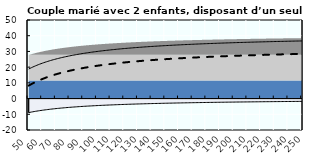
| Category | Coin fiscal moyen (somme des composantes) | Taux moyen d'imposition net en % du salaire brut |
|---|---|---|
| 50.0 | 18.798 | 8.242 |
| 51.0 | 19.236 | 8.737 |
| 52.0 | 19.658 | 9.213 |
| 53.0 | 20.063 | 9.671 |
| 54.0 | 20.454 | 10.113 |
| 55.0 | 20.83 | 10.538 |
| 56.0 | 21.193 | 10.948 |
| 57.0 | 21.543 | 11.344 |
| 58.0 | 21.881 | 11.726 |
| 59.0 | 22.208 | 12.095 |
| 60.0 | 22.523 | 12.451 |
| 61.0 | 22.829 | 12.796 |
| 62.0 | 23.124 | 13.13 |
| 63.0 | 23.41 | 13.454 |
| 64.0 | 23.688 | 13.767 |
| 65.0 | 23.956 | 14.071 |
| 66.0 | 24.217 | 14.365 |
| 67.0 | 24.469 | 14.65 |
| 68.0 | 24.715 | 14.928 |
| 69.0 | 24.953 | 15.197 |
| 70.0 | 25.184 | 15.458 |
| 71.0 | 25.409 | 15.712 |
| 72.0 | 25.628 | 15.959 |
| 73.0 | 25.84 | 16.2 |
| 74.0 | 26.047 | 16.434 |
| 75.0 | 26.249 | 16.661 |
| 76.0 | 26.445 | 16.883 |
| 77.0 | 26.636 | 17.098 |
| 78.0 | 26.822 | 17.309 |
| 79.0 | 27.003 | 17.514 |
| 80.0 | 27.18 | 17.714 |
| 81.0 | 27.353 | 17.908 |
| 82.0 | 27.521 | 18.099 |
| 83.0 | 27.685 | 18.284 |
| 84.0 | 27.845 | 18.465 |
| 85.0 | 28.002 | 18.642 |
| 86.0 | 28.155 | 18.815 |
| 87.0 | 28.304 | 18.984 |
| 88.0 | 28.45 | 19.149 |
| 89.0 | 28.593 | 19.31 |
| 90.0 | 28.732 | 19.468 |
| 91.0 | 28.869 | 19.622 |
| 92.0 | 29.002 | 19.773 |
| 93.0 | 29.133 | 19.92 |
| 94.0 | 29.261 | 20.065 |
| 95.0 | 29.386 | 20.206 |
| 96.0 | 29.509 | 20.345 |
| 97.0 | 29.629 | 20.48 |
| 98.0 | 29.746 | 20.613 |
| 99.0 | 29.861 | 20.743 |
| 100.0 | 29.974 | 20.871 |
| 101.0 | 30.085 | 20.996 |
| 102.0 | 30.193 | 21.118 |
| 103.0 | 30.3 | 21.239 |
| 104.0 | 30.404 | 21.357 |
| 105.0 | 30.506 | 21.472 |
| 106.0 | 30.607 | 21.586 |
| 107.0 | 30.705 | 21.697 |
| 108.0 | 30.802 | 21.806 |
| 109.0 | 30.897 | 21.914 |
| 110.0 | 30.99 | 22.019 |
| 111.0 | 31.082 | 22.122 |
| 112.0 | 31.172 | 22.224 |
| 113.0 | 31.26 | 22.324 |
| 114.0 | 31.347 | 22.422 |
| 115.0 | 31.432 | 22.518 |
| 116.0 | 31.516 | 22.613 |
| 117.0 | 31.598 | 22.706 |
| 118.0 | 31.679 | 22.797 |
| 119.0 | 31.759 | 22.887 |
| 120.0 | 31.837 | 22.976 |
| 121.0 | 31.914 | 23.063 |
| 122.0 | 31.99 | 23.148 |
| 123.0 | 32.064 | 23.232 |
| 124.0 | 32.137 | 23.315 |
| 125.0 | 32.209 | 23.397 |
| 126.0 | 32.28 | 23.477 |
| 127.0 | 32.35 | 23.556 |
| 128.0 | 32.419 | 23.633 |
| 129.0 | 32.487 | 23.71 |
| 130.0 | 32.553 | 23.785 |
| 131.0 | 32.619 | 23.859 |
| 132.0 | 32.684 | 23.932 |
| 133.0 | 32.747 | 24.004 |
| 134.0 | 32.81 | 24.075 |
| 135.0 | 32.872 | 24.145 |
| 136.0 | 32.933 | 24.214 |
| 137.0 | 32.993 | 24.282 |
| 138.0 | 33.052 | 24.348 |
| 139.0 | 33.11 | 24.414 |
| 140.0 | 33.167 | 24.479 |
| 141.0 | 33.224 | 24.543 |
| 142.0 | 33.28 | 24.606 |
| 143.0 | 33.335 | 24.668 |
| 144.0 | 33.389 | 24.73 |
| 145.0 | 33.443 | 24.79 |
| 146.0 | 33.495 | 24.85 |
| 147.0 | 33.548 | 24.909 |
| 148.0 | 33.599 | 24.967 |
| 149.0 | 33.65 | 25.024 |
| 150.0 | 33.7 | 25.081 |
| 151.0 | 33.749 | 25.136 |
| 152.0 | 33.798 | 25.191 |
| 153.0 | 33.846 | 25.246 |
| 154.0 | 33.893 | 25.299 |
| 155.0 | 33.94 | 25.352 |
| 156.0 | 33.986 | 25.404 |
| 157.0 | 34.032 | 25.456 |
| 158.0 | 34.077 | 25.507 |
| 159.0 | 34.121 | 25.557 |
| 160.0 | 34.165 | 25.607 |
| 161.0 | 34.209 | 25.656 |
| 162.0 | 34.252 | 25.704 |
| 163.0 | 34.294 | 25.752 |
| 164.0 | 34.336 | 25.799 |
| 165.0 | 34.377 | 25.846 |
| 166.0 | 34.418 | 25.892 |
| 167.0 | 34.458 | 25.938 |
| 168.0 | 34.498 | 25.983 |
| 169.0 | 34.537 | 26.027 |
| 170.0 | 34.576 | 26.071 |
| 171.0 | 34.615 | 26.115 |
| 172.0 | 34.653 | 26.157 |
| 173.0 | 34.69 | 26.2 |
| 174.0 | 34.727 | 26.242 |
| 175.0 | 34.764 | 26.283 |
| 176.0 | 34.8 | 26.324 |
| 177.0 | 34.836 | 26.365 |
| 178.0 | 34.872 | 26.405 |
| 179.0 | 34.907 | 26.445 |
| 180.0 | 34.941 | 26.484 |
| 181.0 | 34.976 | 26.523 |
| 182.0 | 35.01 | 26.561 |
| 183.0 | 35.043 | 26.599 |
| 184.0 | 35.076 | 26.636 |
| 185.0 | 35.109 | 26.673 |
| 186.0 | 35.142 | 26.71 |
| 187.0 | 35.174 | 26.746 |
| 188.0 | 35.206 | 26.782 |
| 189.0 | 35.237 | 26.818 |
| 190.0 | 35.268 | 26.853 |
| 191.0 | 35.299 | 26.888 |
| 192.0 | 35.329 | 26.922 |
| 193.0 | 35.36 | 26.956 |
| 194.0 | 35.389 | 26.99 |
| 195.0 | 35.419 | 27.024 |
| 196.0 | 35.448 | 27.057 |
| 197.0 | 35.477 | 27.089 |
| 198.0 | 35.506 | 27.122 |
| 199.0 | 35.534 | 27.154 |
| 200.0 | 35.562 | 27.185 |
| 201.0 | 35.59 | 27.217 |
| 202.0 | 35.618 | 27.248 |
| 203.0 | 35.645 | 27.279 |
| 204.0 | 35.672 | 27.309 |
| 205.0 | 35.699 | 27.339 |
| 206.0 | 35.725 | 27.369 |
| 207.0 | 35.751 | 27.399 |
| 208.0 | 35.777 | 27.428 |
| 209.0 | 35.803 | 27.457 |
| 210.0 | 35.828 | 27.486 |
| 211.0 | 35.854 | 27.515 |
| 212.0 | 35.879 | 27.543 |
| 213.0 | 35.903 | 27.571 |
| 214.0 | 35.928 | 27.599 |
| 215.0 | 35.952 | 27.626 |
| 216.0 | 35.976 | 27.653 |
| 217.0 | 36 | 27.68 |
| 218.0 | 36.024 | 27.707 |
| 219.0 | 36.047 | 27.733 |
| 220.0 | 36.07 | 27.759 |
| 221.0 | 36.093 | 27.785 |
| 222.0 | 36.116 | 27.811 |
| 223.0 | 36.139 | 27.837 |
| 224.0 | 36.161 | 27.862 |
| 225.0 | 36.183 | 27.887 |
| 226.0 | 36.205 | 27.912 |
| 227.0 | 36.227 | 27.936 |
| 228.0 | 36.249 | 27.961 |
| 229.0 | 36.27 | 27.985 |
| 230.0 | 36.291 | 28.009 |
| 231.0 | 36.312 | 28.033 |
| 232.0 | 36.333 | 28.056 |
| 233.0 | 36.354 | 28.08 |
| 234.0 | 36.374 | 28.103 |
| 235.0 | 36.395 | 28.126 |
| 236.0 | 36.415 | 28.149 |
| 237.0 | 36.435 | 28.171 |
| 238.0 | 36.455 | 28.194 |
| 239.0 | 36.474 | 28.216 |
| 240.0 | 36.494 | 28.238 |
| 241.0 | 36.513 | 28.26 |
| 242.0 | 36.532 | 28.281 |
| 243.0 | 36.551 | 28.303 |
| 244.0 | 36.57 | 28.324 |
| 245.0 | 36.589 | 28.345 |
| 246.0 | 36.607 | 28.366 |
| 247.0 | 36.626 | 28.387 |
| 248.0 | 36.644 | 28.408 |
| 249.0 | 36.662 | 28.428 |
| 250.0 | 36.68 | 28.448 |